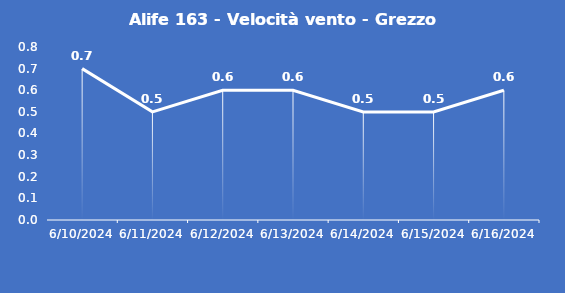
| Category | Alife 163 - Velocità vento - Grezzo (m/s) |
|---|---|
| 6/10/24 | 0.7 |
| 6/11/24 | 0.5 |
| 6/12/24 | 0.6 |
| 6/13/24 | 0.6 |
| 6/14/24 | 0.5 |
| 6/15/24 | 0.5 |
| 6/16/24 | 0.6 |